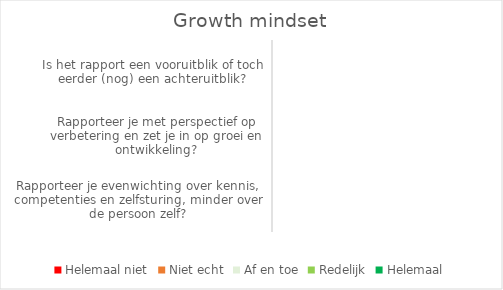
| Category | Helemaal niet | Niet echt | Af en toe | Redelijk | Helemaal |
|---|---|---|---|---|---|
| Rapporteer je evenwichting over kennis, competenties en zelfsturing, minder over de persoon zelf? | 0 | 0 | 0 | 0 | 0 |
| Rapporteer je met perspectief op verbetering en zet je in op groei en ontwikkeling? | 0 | 0 | 0 | 0 | 0 |
| Is het rapport een vooruitblik of toch eerder (nog) een achteruitblik? | 0 | 0 | 0 | 0 | 0 |